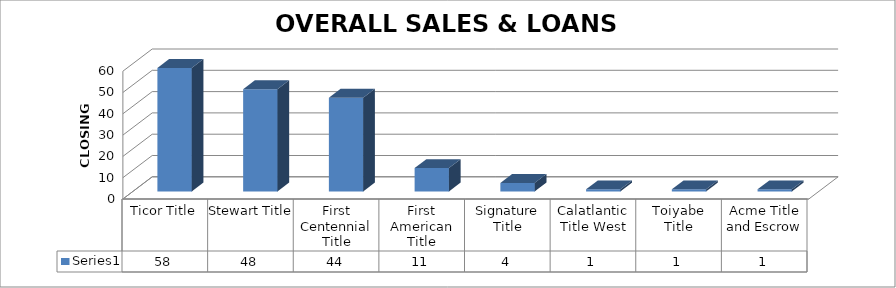
| Category | Series 0 |
|---|---|
| Ticor Title | 58 |
| Stewart Title | 48 |
| First Centennial Title | 44 |
| First American Title | 11 |
| Signature Title | 4 |
| Calatlantic Title West | 1 |
| Toiyabe Title | 1 |
| Acme Title and Escrow | 1 |